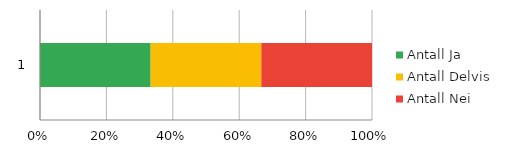
| Category | Antall Ja | Antall Delvis | Antall Nei |
|---|---|---|---|
| 0 | 1 | 1 | 1 |